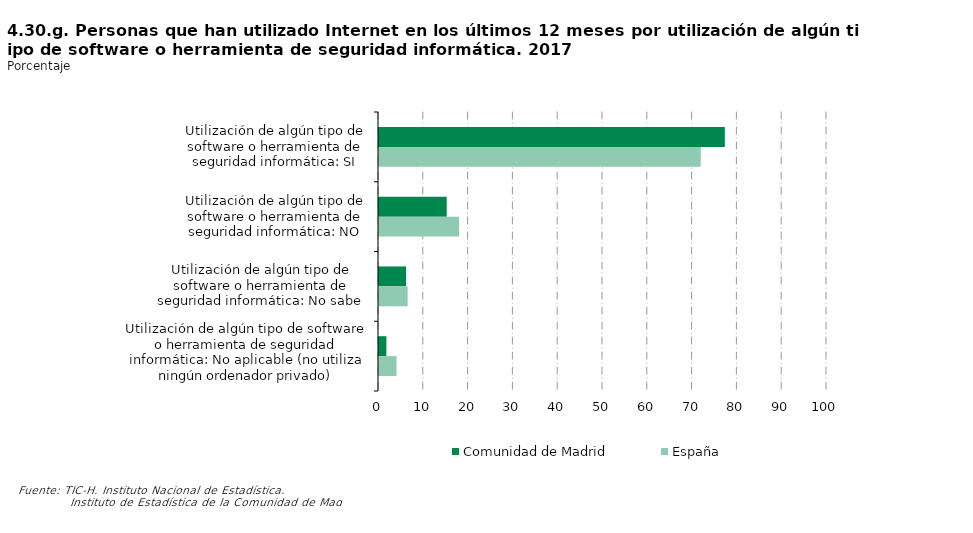
| Category | Comunidad de Madrid | España |
|---|---|---|
| Utilización de algún tipo de software o herramienta de seguridad informática: SI | 77.195 | 71.817 |
| Utilización de algún tipo de software o herramienta de seguridad informática: NO | 15.115 | 17.866 |
| Utilización de algún tipo de software o herramienta de seguridad informática: No sabe | 6.043 | 6.397 |
| Utilización de algún tipo de software o herramienta de seguridad informática: No aplicable (no utiliza ningún ordenador privado) | 1.647 | 3.919 |